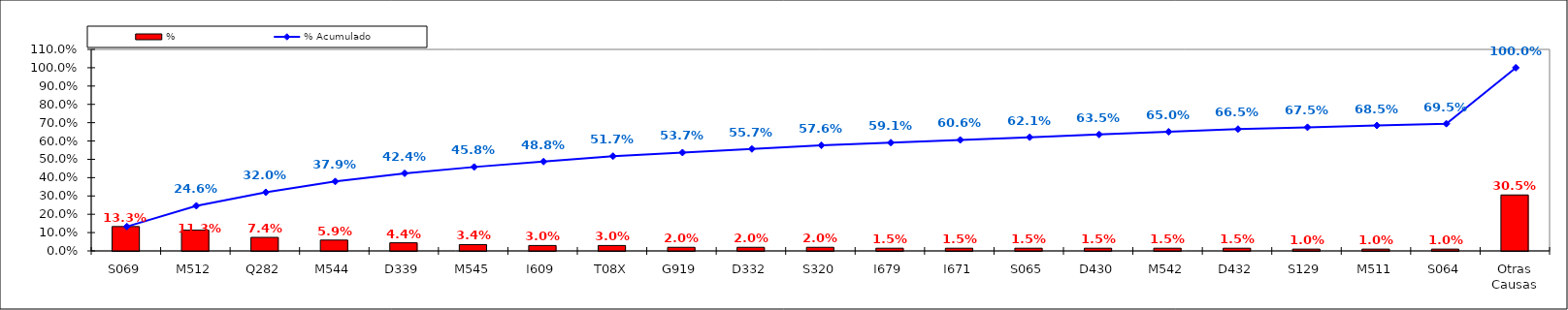
| Category | % |
|---|---|
| S069 | 0.133 |
| M512 | 0.113 |
| Q282 | 0.074 |
| M544 | 0.059 |
| D339 | 0.044 |
| M545 | 0.034 |
| I609 | 0.03 |
| T08X | 0.03 |
| G919 | 0.02 |
| D332 | 0.02 |
| S320 | 0.02 |
| I679 | 0.015 |
| I671 | 0.015 |
| S065 | 0.015 |
| D430 | 0.015 |
| M542 | 0.015 |
| D432 | 0.015 |
| S129 | 0.01 |
| M511 | 0.01 |
| S064 | 0.01 |
| Otras Causas | 0.305 |